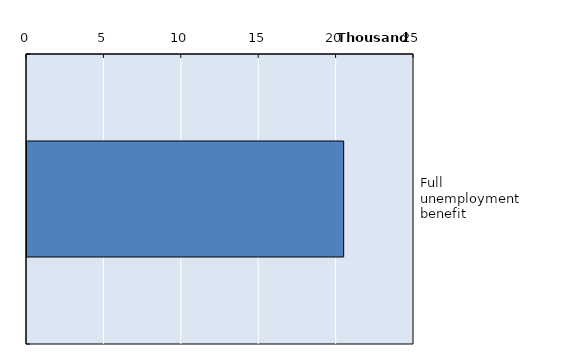
| Category | Series 0 |
|---|---|
| Full unemployment benefit | 20457 |